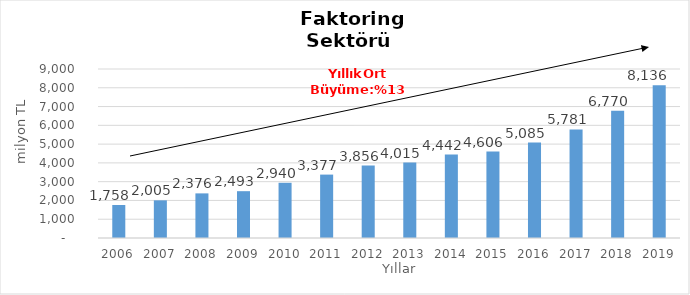
| Category | Faktoring  |
|---|---|
| 2006.0 | 1757.796 |
| 2007.0 | 2005.232 |
| 2008.0 | 2375.996 |
| 2009.0 | 2493.335 |
| 2010.0 | 2940.32 |
| 2011.0 | 3376.552 |
| 2012.0 | 3855.882 |
| 2013.0 | 4014.568 |
| 2014.0 | 4442 |
| 2015.0 | 4606 |
| 2016.0 | 5085 |
| 2017.0 | 5781 |
| 2018.0 | 6770 |
| 2019.0 | 8136 |